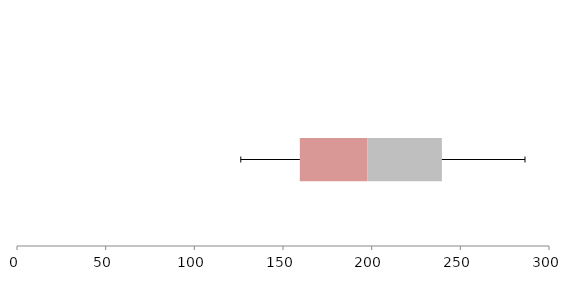
| Category | Series 1 | Series 2 | Series 3 |
|---|---|---|---|
| 0 | 159.495 | 38.191 | 41.911 |